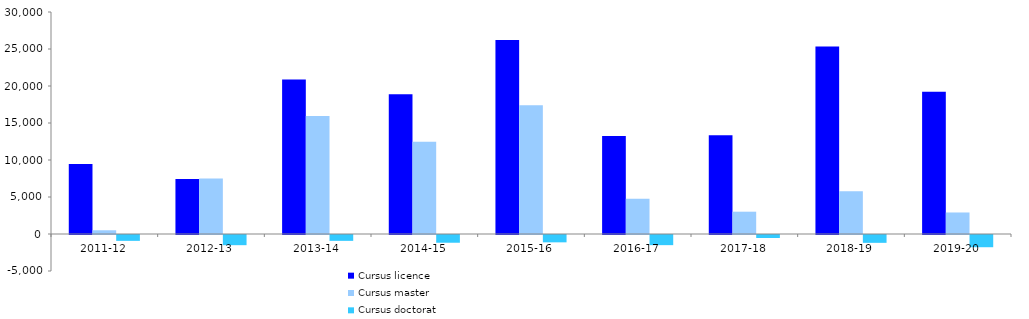
| Category | Cursus licence | Cursus master | Cursus doctorat |
|---|---|---|---|
| 2011-12 | 9465 | 505 | -792 |
| 2012-13 | 7424 | 7497 | -1375 |
| 2013-14 | 20890 | 15955 | -792 |
| 2014-15 | 18871 | 12457 | -1046 |
| 2015-16 | 26212 | 17406 | -992 |
| 2016-17 | 13229 | 4752 | -1372 |
| 2017-18 | 13355 | 3014 | -402 |
| 2018-19 | 25351 | 5770 | -1059 |
| 2019-20 | 19211 | 2908 | -1652 |